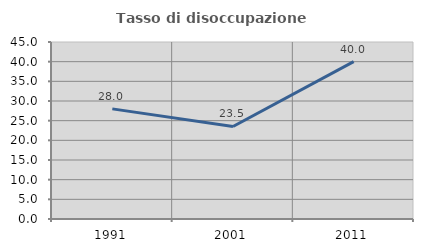
| Category | Tasso di disoccupazione giovanile  |
|---|---|
| 1991.0 | 28 |
| 2001.0 | 23.529 |
| 2011.0 | 40 |